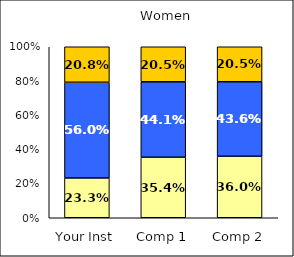
| Category | Low Satisfaction with Courses | Average Satisfaction with Courses | High Satisfaction with Courses |
|---|---|---|---|
| Your Inst | 0.233 | 0.56 | 0.208 |
| Comp 1 | 0.354 | 0.441 | 0.205 |
| Comp 2 | 0.36 | 0.436 | 0.205 |